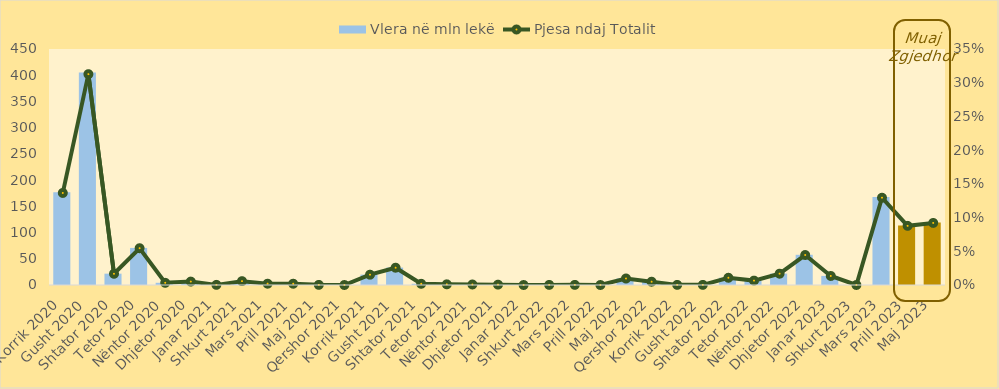
| Category | Vlera në mln lekë |
|---|---|
| Korrik 2020 | 176.8 |
| Gusht 2020 | 405 |
| Shtator 2020 | 21.6 |
| Tetor 2020 | 70.65 |
| Nëntor 2020 | 4.2 |
| Dhjetor 2020 | 6.55 |
| Janar 2021 | 0.25 |
| Shkurt 2021 | 7.4 |
| Mars 2021 | 2.5 |
| Prill 2021 | 2.45 |
| Maj 2021 | 0.25 |
| Qershor 2021 | 0 |
| Korrik 2021 | 19.8 |
| Gusht 2021 | 33.2 |
| Shtator 2021 | 2.3 |
| Tetor 2021 | 1.3 |
| Nëntor 2021 | 1 |
| Dhjetor 2021 | 0.7 |
| Janar 2022 | 0 |
| Shkurt 2022 | 0.2 |
| Mars 2022 | 0.25 |
| Prill 2022 | 0 |
| Maj 2022 | 12.484 |
| Qershor 2022 | 6.307 |
| Korrik 2022 | 0.25 |
| Gusht 2022 | 0.25 |
| Shtator 2022 | 13.89 |
| Tetor 2022 | 8.44 |
| Nëntor 2022 | 21.731 |
| Dhjetor 2022 | 57.589 |
| Janar 2023 | 17.325 |
| Shkurt 2023 | 0 |
| Mars 2023 | 167.612 |
| Prill 2023 | 113.595 |
| Maj 2023 | 119.218 |